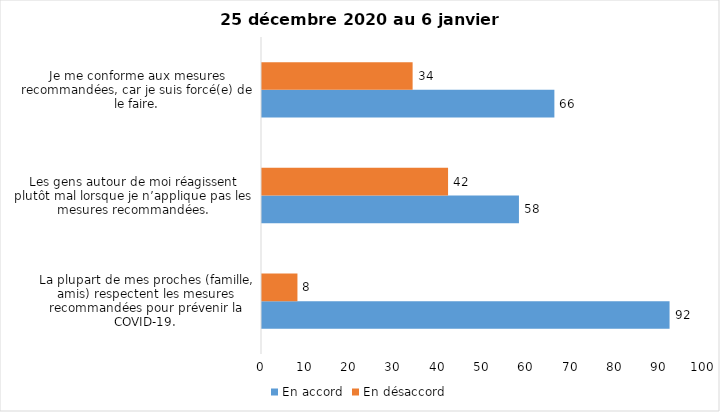
| Category | En accord | En désaccord |
|---|---|---|
| La plupart de mes proches (famille, amis) respectent les mesures recommandées pour prévenir la COVID-19. | 92 | 8 |
| Les gens autour de moi réagissent plutôt mal lorsque je n’applique pas les mesures recommandées. | 58 | 42 |
| Je me conforme aux mesures recommandées, car je suis forcé(e) de le faire. | 66 | 34 |